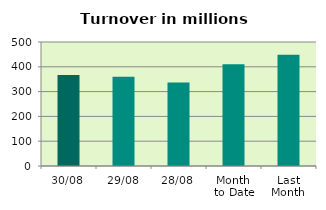
| Category | Series 0 |
|---|---|
| 30/08 | 367.264 |
| 29/08 | 360.38 |
| 28/08 | 336.64 |
| Month 
to Date | 410.207 |
| Last
Month | 448.907 |